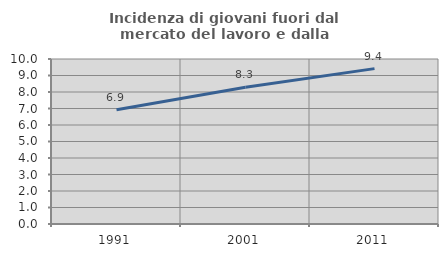
| Category | Incidenza di giovani fuori dal mercato del lavoro e dalla formazione  |
|---|---|
| 1991.0 | 6.929 |
| 2001.0 | 8.286 |
| 2011.0 | 9.417 |